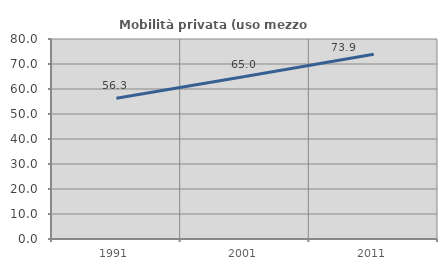
| Category | Mobilità privata (uso mezzo privato) |
|---|---|
| 1991.0 | 56.323 |
| 2001.0 | 65 |
| 2011.0 | 73.871 |